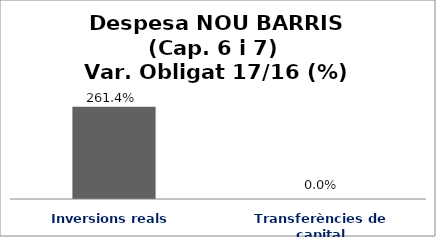
| Category | Series 0 |
|---|---|
| Inversions reals | 2.614 |
| Transferències de capital | 0 |